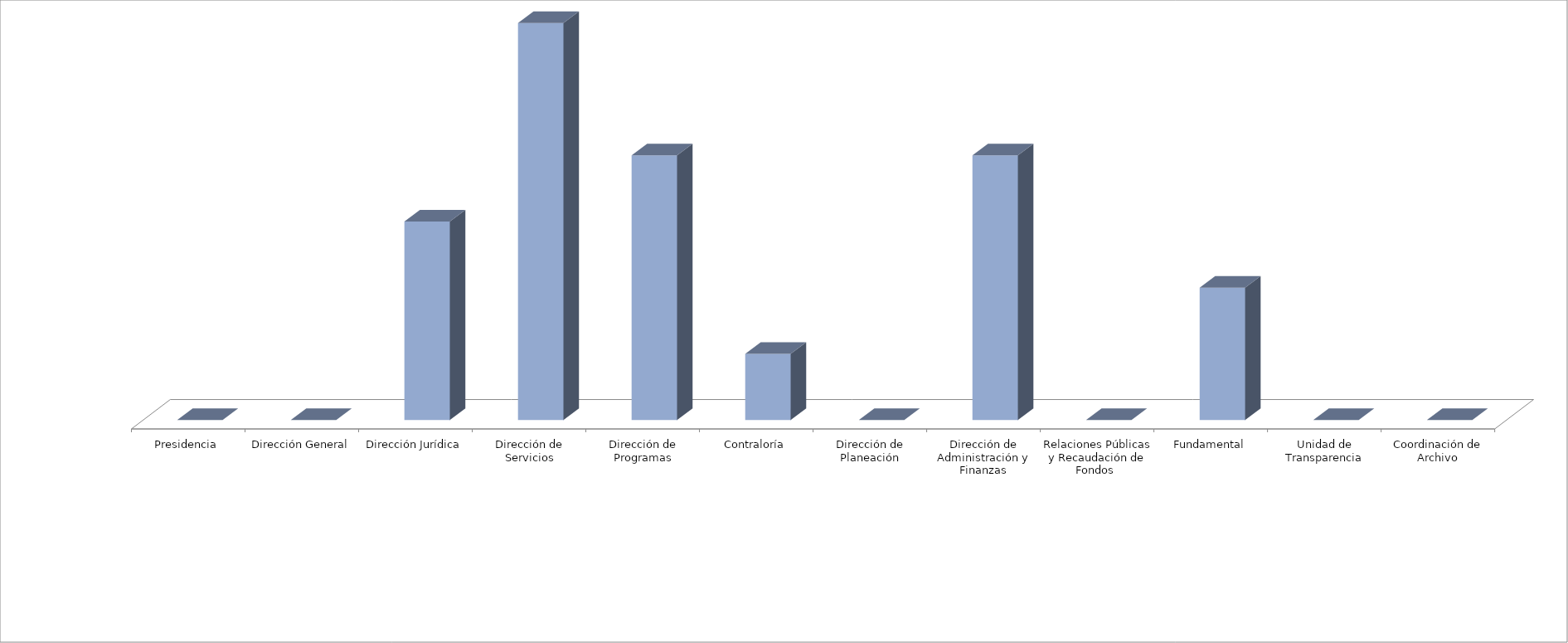
| Category | Series 0 | Series 1 |
|---|---|---|
| Presidencia |  | 0 |
| Dirección General |  | 0 |
| Dirección Jurídica |  | 3 |
| Dirección de Servicios |  | 6 |
| Dirección de Programas |  | 4 |
| Contraloría |  | 1 |
| Dirección de Planeación |  | 0 |
| Dirección de Administración y Finanzas |  | 4 |
| Relaciones Públicas y Recaudación de Fondos  |  | 0 |
| Fundamental |  | 2 |
| Unidad de Transparencia |  | 0 |
| Coordinación de Archivo |  | 0 |